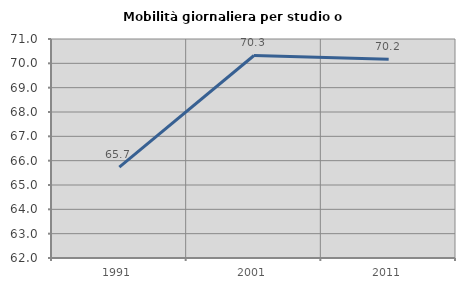
| Category | Mobilità giornaliera per studio o lavoro |
|---|---|
| 1991.0 | 65.733 |
| 2001.0 | 70.322 |
| 2011.0 | 70.173 |